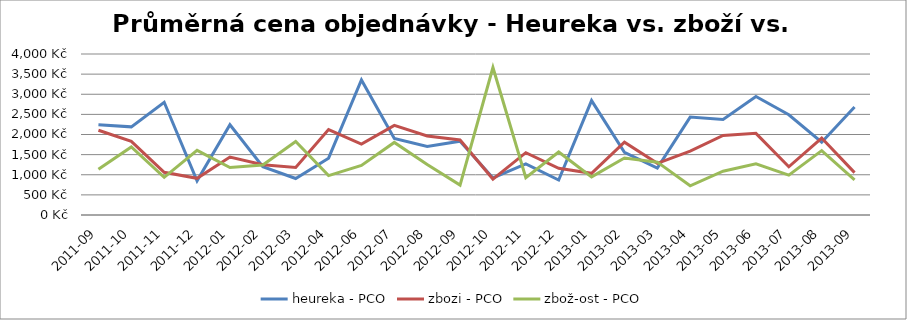
| Category | heureka - PCO | zbozi - PCO | zbož-ost - PCO |
|---|---|---|---|
| 2011-09 | 2244.933 | 2105.587 | 1133.947 |
| 2011-10 | 2189.859 | 1829.092 | 1689.773 |
| 2011-11 | 2801.286 | 1061.472 | 936.34 |
| 2011-12 | 848.126 | 911.916 | 1606.095 |
| 2012-01 | 2241.999 | 1439.487 | 1179.441 |
| 2012-02 | 1202.161 | 1248.15 | 1241.882 |
| 2012-03 | 906.815 | 1180.674 | 1826.745 |
| 2012-04 | 1412.079 | 2123.37 | 979.254 |
| 2012-06 | 3354.437 | 1763.242 | 1230.871 |
| 2012-07 | 1901.24 | 2225.153 | 1803.439 |
| 2012-08 | 1702.393 | 1963.215 | 1251.909 |
| 2012-09 | 1834.387 | 1864.894 | 743.213 |
| 2012-10 | 920.664 | 892.77 | 3664.644 |
| 2012-11 | 1270.206 | 1549.247 | 928.564 |
| 2012-12 | 870.24 | 1159.737 | 1565.778 |
| 2013-01 | 2842.047 | 1036.267 | 948.18 |
| 2013-02 | 1558.814 | 1809.146 | 1416.626 |
| 2013-03 | 1166.075 | 1284.653 | 1313.17 |
| 2013-04 | 2432.195 | 1587.356 | 724.427 |
| 2013-05 | 2373.169 | 1975.899 | 1089.138 |
| 2013-06 | 2943.754 | 2029.145 | 1269.848 |
| 2013-07 | 2490.187 | 1198.285 | 991.306 |
| 2013-08 | 1808.908 | 1912.553 | 1599.276 |
| 2013-09 | 2680.835 | 1052.931 | 869.756 |